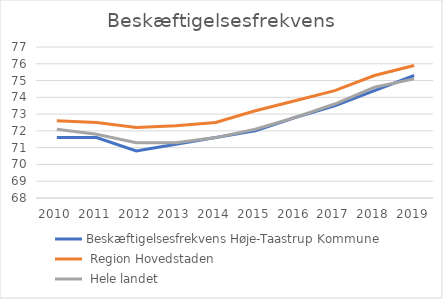
| Category | Beskæftigelsesfrekvens |
|---|---|
| 2010.0 | 72.1 |
| 2011.0 | 71.8 |
| 2012.0 | 71.3 |
| 2013.0 | 71.3 |
| 2014.0 | 71.6 |
| 2015.0 | 72.1 |
| 2016.0 | 72.8 |
| 2017.0 | 73.6 |
| 2018.0 | 74.6 |
| 2019.0 | 75.1 |